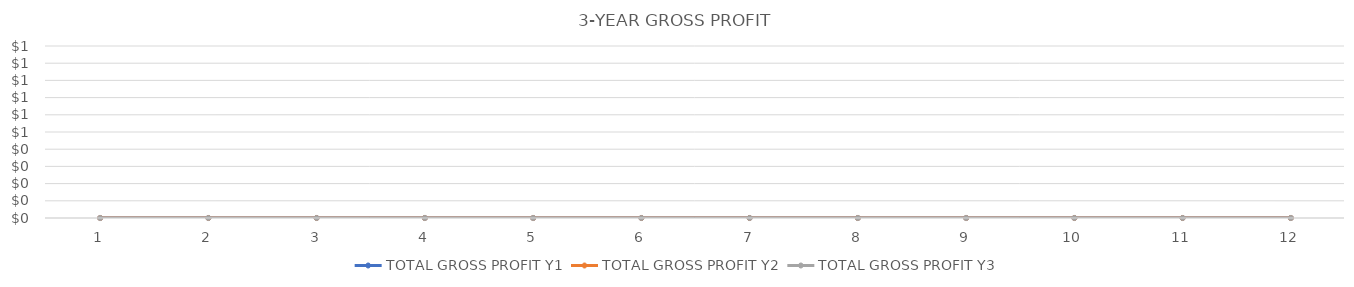
| Category | TOTAL GROSS PROFIT Y1 | TOTAL GROSS PROFIT Y2 | TOTAL GROSS PROFIT Y3 |
|---|---|---|---|
| 0 | 0 | 0 | 0 |
| 1 | 0 | 0 | 0 |
| 2 | 0 | 0 | 0 |
| 3 | 0 | 0 | 0 |
| 4 | 0 | 0 | 0 |
| 5 | 0 | 0 | 0 |
| 6 | 0 | 0 | 0 |
| 7 | 0 | 0 | 0 |
| 8 | 0 | 0 | 0 |
| 9 | 0 | 0 | 0 |
| 10 | 0 | 0 | 0 |
| 11 | 0 | 0 | 0 |